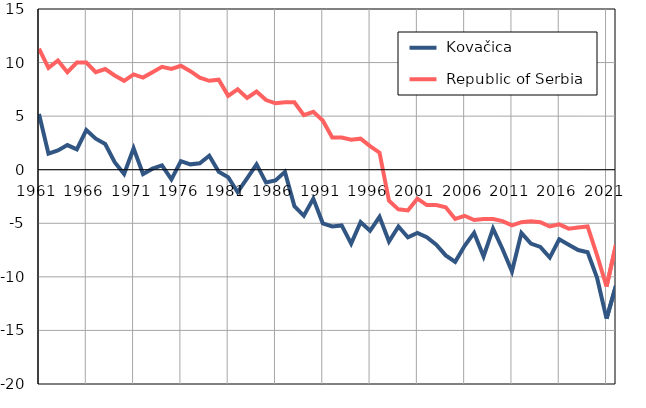
| Category |  Kovačica |  Republic of Serbia |
|---|---|---|
| 1961.0 | 5.2 | 11.3 |
| 1962.0 | 1.5 | 9.5 |
| 1963.0 | 1.8 | 10.2 |
| 1964.0 | 2.3 | 9.1 |
| 1965.0 | 1.9 | 10 |
| 1966.0 | 3.7 | 10 |
| 1967.0 | 2.9 | 9.1 |
| 1968.0 | 2.4 | 9.4 |
| 1969.0 | 0.7 | 8.8 |
| 1970.0 | -0.4 | 8.3 |
| 1971.0 | 2 | 8.9 |
| 1972.0 | -0.4 | 8.6 |
| 1973.0 | 0.1 | 9.1 |
| 1974.0 | 0.4 | 9.6 |
| 1975.0 | -0.9 | 9.4 |
| 1976.0 | 0.8 | 9.7 |
| 1977.0 | 0.5 | 9.2 |
| 1978.0 | 0.6 | 8.6 |
| 1979.0 | 1.3 | 8.3 |
| 1980.0 | -0.2 | 8.4 |
| 1981.0 | -0.7 | 6.9 |
| 1982.0 | -2.1 | 7.5 |
| 1983.0 | -0.8 | 6.7 |
| 1984.0 | 0.5 | 7.3 |
| 1985.0 | -1.2 | 6.5 |
| 1986.0 | -1 | 6.2 |
| 1987.0 | -0.2 | 6.3 |
| 1988.0 | -3.4 | 6.3 |
| 1989.0 | -4.3 | 5.1 |
| 1990.0 | -2.7 | 5.4 |
| 1991.0 | -5 | 4.6 |
| 1992.0 | -5.3 | 3 |
| 1993.0 | -5.2 | 3 |
| 1994.0 | -6.9 | 2.8 |
| 1995.0 | -4.9 | 2.9 |
| 1996.0 | -5.7 | 2.2 |
| 1997.0 | -4.4 | 1.6 |
| 1998.0 | -6.7 | -2.9 |
| 1999.0 | -5.3 | -3.7 |
| 2000.0 | -6.3 | -3.8 |
| 2001.0 | -5.9 | -2.7 |
| 2002.0 | -6.3 | -3.3 |
| 2003.0 | -7 | -3.3 |
| 2004.0 | -8 | -3.5 |
| 2005.0 | -8.6 | -4.6 |
| 2006.0 | -7.1 | -4.3 |
| 2007.0 | -5.9 | -4.7 |
| 2008.0 | -8.1 | -4.6 |
| 2009.0 | -5.5 | -4.6 |
| 2010.0 | -7.4 | -4.8 |
| 2011.0 | -9.5 | -5.2 |
| 2012.0 | -5.9 | -4.9 |
| 2013.0 | -6.9 | -4.8 |
| 2014.0 | -7.2 | -4.9 |
| 2015.0 | -8.2 | -5.3 |
| 2016.0 | -6.5 | -5.1 |
| 2017.0 | -7 | -5.5 |
| 2018.0 | -7.5 | -5.4 |
| 2019.0 | -7.7 | -5.3 |
| 2020.0 | -10.1 | -8 |
| 2021.0 | -13.9 | -10.9 |
| 2022.0 | -10.8 | -7 |